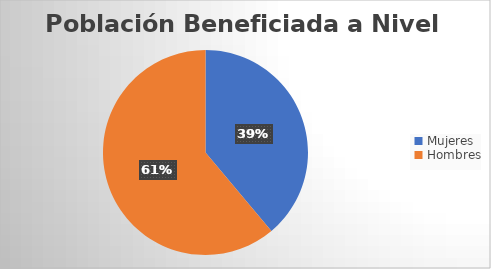
| Category | Series 0 |
|---|---|
| Mujeres | 266 |
| Hombres | 418 |